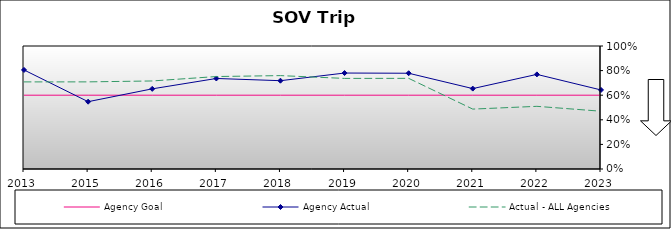
| Category | Agency Goal | Agency Actual | Actual - ALL Agencies |
|---|---|---|---|
| 2013.0 | 0.6 | 0.805 | 0.708 |
| 2015.0 | 0.6 | 0.547 | 0.708 |
| 2016.0 | 0.6 | 0.652 | 0.716 |
| 2017.0 | 0.6 | 0.736 | 0.752 |
| 2018.0 | 0.6 | 0.718 | 0.759 |
| 2019.0 | 0.6 | 0.78 | 0.736 |
| 2020.0 | 0.6 | 0.778 | 0.737 |
| 2021.0 | 0.6 | 0.654 | 0.487 |
| 2022.0 | 0.6 | 0.769 | 0.509 |
| 2023.0 | 0.6 | 0.643 | 0.47 |